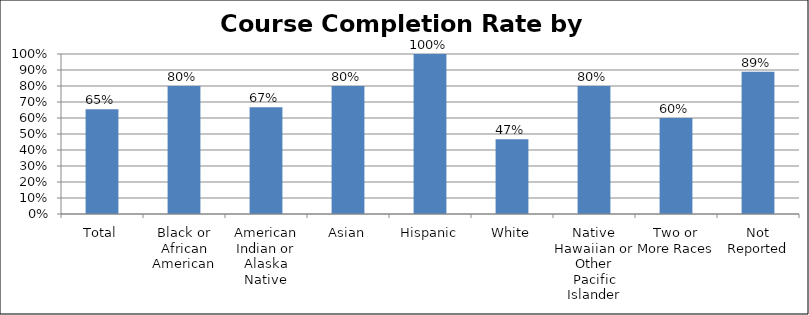
| Category | Course Completion Rate |
|---|---|
| Total | 0.655 |
| Black or African American | 0.8 |
| American Indian or Alaska Native | 0.667 |
| Asian | 0.8 |
| Hispanic | 1 |
| White | 0.467 |
| Native Hawaiian or Other Pacific Islander | 0.8 |
| Two or More Races | 0.6 |
| Not Reported | 0.889 |